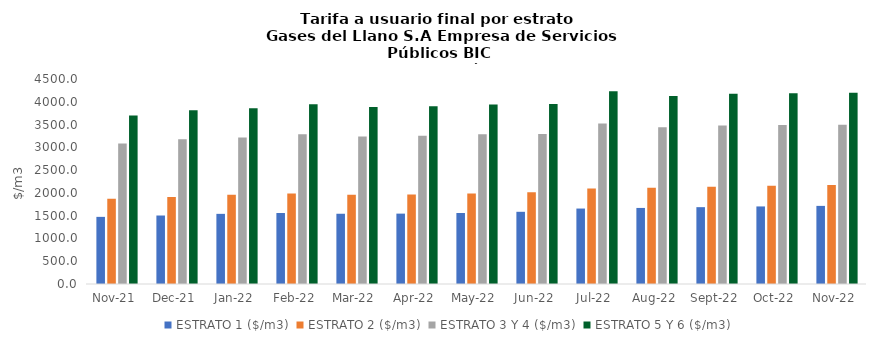
| Category | ESTRATO 1 ($/m3) | ESTRATO 2 ($/m3) | ESTRATO 3 Y 4 ($/m3) | ESTRATO 5 Y 6 ($/m3) |
|---|---|---|---|---|
| 2021-11-01 | 1473.59 | 1868.74 | 3084.28 | 3701.136 |
| 2021-12-01 | 1503.37 | 1908.8 | 3176.73 | 3812.076 |
| 2022-01-01 | 1539.93 | 1960.98 | 3216.6 | 3859.92 |
| 2022-02-01 | 1558.18 | 1985.61 | 3289.23 | 3947.076 |
| 2022-03-01 | 1542.04 | 1958.44 | 3238.74 | 3886.488 |
| 2022-04-01 | 1544.93 | 1966.39 | 3252.39 | 3902.868 |
| 2022-05-01 | 1558.87 | 1984.13 | 3284.52 | 3941.424 |
| 2022-06-01 | 1584.89 | 2012.95 | 3290.9 | 3949.08 |
| 2022-07-01 | 1656.22 | 2098.37 | 3524.51 | 4229.412 |
| 2022-08-01 | 1669.64 | 2115.37 | 3440.02 | 4128.024 |
| 2022-09-01 | 1686.8 | 2137.11 | 3480.88 | 4177.056 |
| 2022-10-01 | 1702.57 | 2157.09 | 3487.76 | 4185.312 |
| 2022-11-01 | 1714.74 | 2172.52 | 3496.7 | 4196.04 |